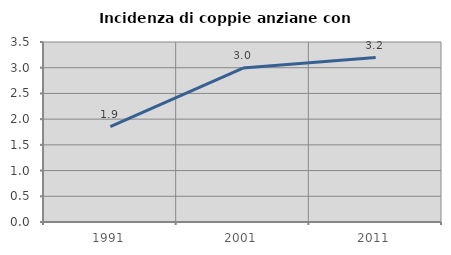
| Category | Incidenza di coppie anziane con figli |
|---|---|
| 1991.0 | 1.855 |
| 2001.0 | 2.992 |
| 2011.0 | 3.196 |